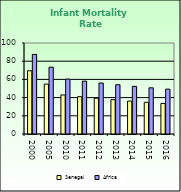
| Category | Senegal | Africa |
|---|---|---|
| 2000.0 | 69.5 | 87.462 |
| 2005.0 | 54.8 | 73.418 |
| 2010.0 | 42.9 | 60.345 |
| 2011.0 | 41 | 58.107 |
| 2012.0 | 39.3 | 56.032 |
| 2013.0 | 37.7 | 54.131 |
| 2014.0 | 36.2 | 52.336 |
| 2015.0 | 34.8 | 50.754 |
| 2016.0 | 33.6 | 49.283 |